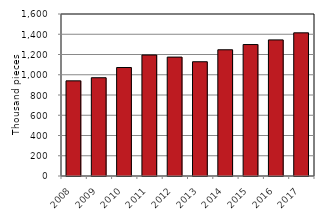
| Category | Series 0 |
|---|---|
| 2008.0 | 939721 |
| 2009.0 | 970632 |
| 2010.0 | 1071315 |
| 2011.0 | 1194959 |
| 2012.0 | 1174266 |
| 2013.0 | 1128468 |
| 2014.0 | 1246645 |
| 2015.0 | 1298206 |
| 2016.0 | 1344212 |
| 2017.0 | 1413940 |